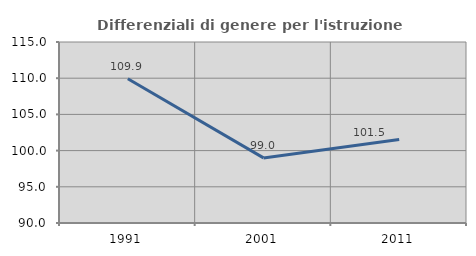
| Category | Differenziali di genere per l'istruzione superiore |
|---|---|
| 1991.0 | 109.931 |
| 2001.0 | 98.99 |
| 2011.0 | 101.543 |